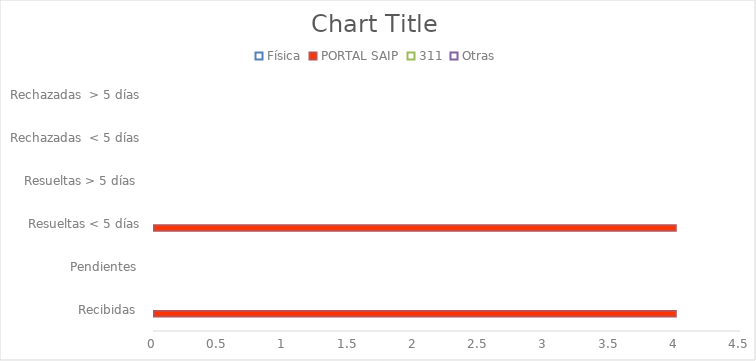
| Category | Física | PORTAL SAIP | 311 | Otras |
|---|---|---|---|---|
| Recibidas  | 0 | 4 | 0 | 0 |
| Pendientes  | 0 | 0 | 0 | 0 |
| Resueltas < 5 días | 0 | 4 | 0 | 0 |
| Resueltas > 5 días  | 0 | 0 | 0 | 0 |
| Rechazadas  < 5 días | 0 | 0 | 0 | 0 |
| Rechazadas  > 5 días | 0 | 0 | 0 | 0 |